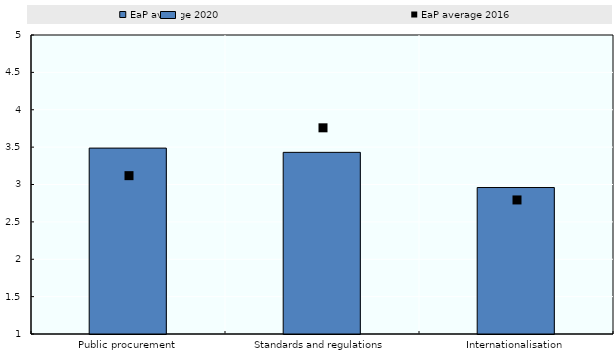
| Category | EaP average 2020 |
|---|---|
| Public procurement | 3.487 |
| Standards and regulations | 3.43 |
| Internationalisation | 2.959 |